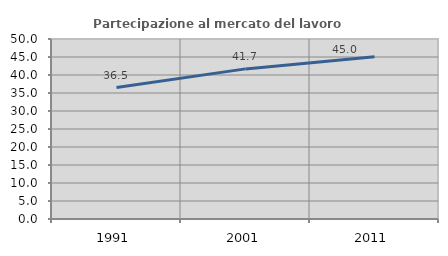
| Category | Partecipazione al mercato del lavoro  femminile |
|---|---|
| 1991.0 | 36.518 |
| 2001.0 | 41.698 |
| 2011.0 | 45.037 |